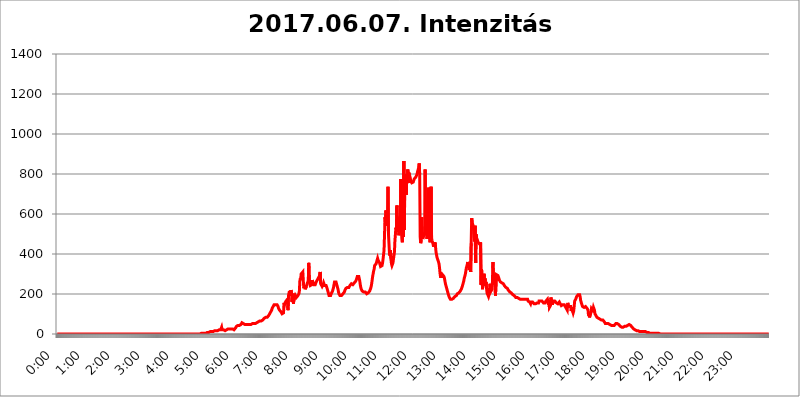
| Category | 2017.06.07. Intenzitás [W/m^2] |
|---|---|
| 0.0 | 0 |
| 0.0006944444444444445 | 0 |
| 0.001388888888888889 | 0 |
| 0.0020833333333333333 | 0 |
| 0.002777777777777778 | 0 |
| 0.003472222222222222 | 0 |
| 0.004166666666666667 | 0 |
| 0.004861111111111111 | 0 |
| 0.005555555555555556 | 0 |
| 0.0062499999999999995 | 0 |
| 0.006944444444444444 | 0 |
| 0.007638888888888889 | 0 |
| 0.008333333333333333 | 0 |
| 0.009027777777777779 | 0 |
| 0.009722222222222222 | 0 |
| 0.010416666666666666 | 0 |
| 0.011111111111111112 | 0 |
| 0.011805555555555555 | 0 |
| 0.012499999999999999 | 0 |
| 0.013194444444444444 | 0 |
| 0.013888888888888888 | 0 |
| 0.014583333333333332 | 0 |
| 0.015277777777777777 | 0 |
| 0.015972222222222224 | 0 |
| 0.016666666666666666 | 0 |
| 0.017361111111111112 | 0 |
| 0.018055555555555557 | 0 |
| 0.01875 | 0 |
| 0.019444444444444445 | 0 |
| 0.02013888888888889 | 0 |
| 0.020833333333333332 | 0 |
| 0.02152777777777778 | 0 |
| 0.022222222222222223 | 0 |
| 0.02291666666666667 | 0 |
| 0.02361111111111111 | 0 |
| 0.024305555555555556 | 0 |
| 0.024999999999999998 | 0 |
| 0.025694444444444447 | 0 |
| 0.02638888888888889 | 0 |
| 0.027083333333333334 | 0 |
| 0.027777777777777776 | 0 |
| 0.02847222222222222 | 0 |
| 0.029166666666666664 | 0 |
| 0.029861111111111113 | 0 |
| 0.030555555555555555 | 0 |
| 0.03125 | 0 |
| 0.03194444444444445 | 0 |
| 0.03263888888888889 | 0 |
| 0.03333333333333333 | 0 |
| 0.034027777777777775 | 0 |
| 0.034722222222222224 | 0 |
| 0.035416666666666666 | 0 |
| 0.036111111111111115 | 0 |
| 0.03680555555555556 | 0 |
| 0.0375 | 0 |
| 0.03819444444444444 | 0 |
| 0.03888888888888889 | 0 |
| 0.03958333333333333 | 0 |
| 0.04027777777777778 | 0 |
| 0.04097222222222222 | 0 |
| 0.041666666666666664 | 0 |
| 0.042361111111111106 | 0 |
| 0.04305555555555556 | 0 |
| 0.043750000000000004 | 0 |
| 0.044444444444444446 | 0 |
| 0.04513888888888889 | 0 |
| 0.04583333333333334 | 0 |
| 0.04652777777777778 | 0 |
| 0.04722222222222222 | 0 |
| 0.04791666666666666 | 0 |
| 0.04861111111111111 | 0 |
| 0.049305555555555554 | 0 |
| 0.049999999999999996 | 0 |
| 0.05069444444444445 | 0 |
| 0.051388888888888894 | 0 |
| 0.052083333333333336 | 0 |
| 0.05277777777777778 | 0 |
| 0.05347222222222222 | 0 |
| 0.05416666666666667 | 0 |
| 0.05486111111111111 | 0 |
| 0.05555555555555555 | 0 |
| 0.05625 | 0 |
| 0.05694444444444444 | 0 |
| 0.057638888888888885 | 0 |
| 0.05833333333333333 | 0 |
| 0.05902777777777778 | 0 |
| 0.059722222222222225 | 0 |
| 0.06041666666666667 | 0 |
| 0.061111111111111116 | 0 |
| 0.06180555555555556 | 0 |
| 0.0625 | 0 |
| 0.06319444444444444 | 0 |
| 0.06388888888888888 | 0 |
| 0.06458333333333334 | 0 |
| 0.06527777777777778 | 0 |
| 0.06597222222222222 | 0 |
| 0.06666666666666667 | 0 |
| 0.06736111111111111 | 0 |
| 0.06805555555555555 | 0 |
| 0.06874999999999999 | 0 |
| 0.06944444444444443 | 0 |
| 0.07013888888888889 | 0 |
| 0.07083333333333333 | 0 |
| 0.07152777777777779 | 0 |
| 0.07222222222222223 | 0 |
| 0.07291666666666667 | 0 |
| 0.07361111111111111 | 0 |
| 0.07430555555555556 | 0 |
| 0.075 | 0 |
| 0.07569444444444444 | 0 |
| 0.0763888888888889 | 0 |
| 0.07708333333333334 | 0 |
| 0.07777777777777778 | 0 |
| 0.07847222222222222 | 0 |
| 0.07916666666666666 | 0 |
| 0.0798611111111111 | 0 |
| 0.08055555555555556 | 0 |
| 0.08125 | 0 |
| 0.08194444444444444 | 0 |
| 0.08263888888888889 | 0 |
| 0.08333333333333333 | 0 |
| 0.08402777777777777 | 0 |
| 0.08472222222222221 | 0 |
| 0.08541666666666665 | 0 |
| 0.08611111111111112 | 0 |
| 0.08680555555555557 | 0 |
| 0.08750000000000001 | 0 |
| 0.08819444444444445 | 0 |
| 0.08888888888888889 | 0 |
| 0.08958333333333333 | 0 |
| 0.09027777777777778 | 0 |
| 0.09097222222222222 | 0 |
| 0.09166666666666667 | 0 |
| 0.09236111111111112 | 0 |
| 0.09305555555555556 | 0 |
| 0.09375 | 0 |
| 0.09444444444444444 | 0 |
| 0.09513888888888888 | 0 |
| 0.09583333333333333 | 0 |
| 0.09652777777777777 | 0 |
| 0.09722222222222222 | 0 |
| 0.09791666666666667 | 0 |
| 0.09861111111111111 | 0 |
| 0.09930555555555555 | 0 |
| 0.09999999999999999 | 0 |
| 0.10069444444444443 | 0 |
| 0.1013888888888889 | 0 |
| 0.10208333333333335 | 0 |
| 0.10277777777777779 | 0 |
| 0.10347222222222223 | 0 |
| 0.10416666666666667 | 0 |
| 0.10486111111111111 | 0 |
| 0.10555555555555556 | 0 |
| 0.10625 | 0 |
| 0.10694444444444444 | 0 |
| 0.1076388888888889 | 0 |
| 0.10833333333333334 | 0 |
| 0.10902777777777778 | 0 |
| 0.10972222222222222 | 0 |
| 0.1111111111111111 | 0 |
| 0.11180555555555556 | 0 |
| 0.11180555555555556 | 0 |
| 0.1125 | 0 |
| 0.11319444444444444 | 0 |
| 0.11388888888888889 | 0 |
| 0.11458333333333333 | 0 |
| 0.11527777777777777 | 0 |
| 0.11597222222222221 | 0 |
| 0.11666666666666665 | 0 |
| 0.1173611111111111 | 0 |
| 0.11805555555555557 | 0 |
| 0.11944444444444445 | 0 |
| 0.12013888888888889 | 0 |
| 0.12083333333333333 | 0 |
| 0.12152777777777778 | 0 |
| 0.12222222222222223 | 0 |
| 0.12291666666666667 | 0 |
| 0.12291666666666667 | 0 |
| 0.12361111111111112 | 0 |
| 0.12430555555555556 | 0 |
| 0.125 | 0 |
| 0.12569444444444444 | 0 |
| 0.12638888888888888 | 0 |
| 0.12708333333333333 | 0 |
| 0.16875 | 0 |
| 0.12847222222222224 | 0 |
| 0.12916666666666668 | 0 |
| 0.12986111111111112 | 0 |
| 0.13055555555555556 | 0 |
| 0.13125 | 0 |
| 0.13194444444444445 | 0 |
| 0.1326388888888889 | 0 |
| 0.13333333333333333 | 0 |
| 0.13402777777777777 | 0 |
| 0.13402777777777777 | 0 |
| 0.13472222222222222 | 0 |
| 0.13541666666666666 | 0 |
| 0.1361111111111111 | 0 |
| 0.13749999999999998 | 0 |
| 0.13819444444444443 | 0 |
| 0.1388888888888889 | 0 |
| 0.13958333333333334 | 0 |
| 0.14027777777777778 | 0 |
| 0.14097222222222222 | 0 |
| 0.14166666666666666 | 0 |
| 0.1423611111111111 | 0 |
| 0.14305555555555557 | 0 |
| 0.14375000000000002 | 0 |
| 0.14444444444444446 | 0 |
| 0.1451388888888889 | 0 |
| 0.1451388888888889 | 0 |
| 0.14652777777777778 | 0 |
| 0.14722222222222223 | 0 |
| 0.14791666666666667 | 0 |
| 0.1486111111111111 | 0 |
| 0.14930555555555555 | 0 |
| 0.15 | 0 |
| 0.15069444444444444 | 0 |
| 0.15138888888888888 | 0 |
| 0.15208333333333332 | 0 |
| 0.15277777777777776 | 0 |
| 0.15347222222222223 | 0 |
| 0.15416666666666667 | 0 |
| 0.15486111111111112 | 0 |
| 0.15555555555555556 | 0 |
| 0.15625 | 0 |
| 0.15694444444444444 | 0 |
| 0.15763888888888888 | 0 |
| 0.15833333333333333 | 0 |
| 0.15902777777777777 | 0 |
| 0.15972222222222224 | 0 |
| 0.16041666666666668 | 0 |
| 0.16111111111111112 | 0 |
| 0.16180555555555556 | 0 |
| 0.1625 | 0 |
| 0.16319444444444445 | 0 |
| 0.1638888888888889 | 0 |
| 0.16458333333333333 | 0 |
| 0.16527777777777777 | 0 |
| 0.16597222222222222 | 0 |
| 0.16666666666666666 | 0 |
| 0.1673611111111111 | 0 |
| 0.16805555555555554 | 0 |
| 0.16874999999999998 | 0 |
| 0.16944444444444443 | 0 |
| 0.17013888888888887 | 0 |
| 0.1708333333333333 | 0 |
| 0.17152777777777775 | 0 |
| 0.17222222222222225 | 0 |
| 0.1729166666666667 | 0 |
| 0.17361111111111113 | 0 |
| 0.17430555555555557 | 0 |
| 0.17500000000000002 | 0 |
| 0.17569444444444446 | 0 |
| 0.1763888888888889 | 0 |
| 0.17708333333333334 | 0 |
| 0.17777777777777778 | 0 |
| 0.17847222222222223 | 0 |
| 0.17916666666666667 | 0 |
| 0.1798611111111111 | 0 |
| 0.18055555555555555 | 0 |
| 0.18125 | 0 |
| 0.18194444444444444 | 0 |
| 0.1826388888888889 | 0 |
| 0.18333333333333335 | 0 |
| 0.1840277777777778 | 0 |
| 0.18472222222222223 | 0 |
| 0.18541666666666667 | 0 |
| 0.18611111111111112 | 0 |
| 0.18680555555555556 | 0 |
| 0.1875 | 0 |
| 0.18819444444444444 | 0 |
| 0.18888888888888888 | 0 |
| 0.18958333333333333 | 0 |
| 0.19027777777777777 | 0 |
| 0.1909722222222222 | 0 |
| 0.19166666666666665 | 0 |
| 0.19236111111111112 | 0 |
| 0.19305555555555554 | 0 |
| 0.19375 | 0 |
| 0.19444444444444445 | 0 |
| 0.1951388888888889 | 0 |
| 0.19583333333333333 | 0 |
| 0.19652777777777777 | 0 |
| 0.19722222222222222 | 0 |
| 0.19791666666666666 | 0 |
| 0.1986111111111111 | 0 |
| 0.19930555555555554 | 0 |
| 0.19999999999999998 | 0 |
| 0.20069444444444443 | 0 |
| 0.20138888888888887 | 3.525 |
| 0.2020833333333333 | 3.525 |
| 0.2027777777777778 | 3.525 |
| 0.2034722222222222 | 3.525 |
| 0.2041666666666667 | 3.525 |
| 0.20486111111111113 | 3.525 |
| 0.20555555555555557 | 3.525 |
| 0.20625000000000002 | 3.525 |
| 0.20694444444444446 | 3.525 |
| 0.2076388888888889 | 3.525 |
| 0.20833333333333334 | 3.525 |
| 0.20902777777777778 | 3.525 |
| 0.20972222222222223 | 3.525 |
| 0.21041666666666667 | 7.887 |
| 0.2111111111111111 | 7.887 |
| 0.21180555555555555 | 7.887 |
| 0.2125 | 7.887 |
| 0.21319444444444444 | 12.257 |
| 0.2138888888888889 | 12.257 |
| 0.21458333333333335 | 12.257 |
| 0.2152777777777778 | 12.257 |
| 0.21597222222222223 | 12.257 |
| 0.21666666666666667 | 12.257 |
| 0.21736111111111112 | 12.257 |
| 0.21805555555555556 | 12.257 |
| 0.21875 | 12.257 |
| 0.21944444444444444 | 12.257 |
| 0.22013888888888888 | 12.257 |
| 0.22083333333333333 | 16.636 |
| 0.22152777777777777 | 16.636 |
| 0.2222222222222222 | 16.636 |
| 0.22291666666666665 | 16.636 |
| 0.2236111111111111 | 16.636 |
| 0.22430555555555556 | 16.636 |
| 0.225 | 16.636 |
| 0.22569444444444445 | 16.636 |
| 0.2263888888888889 | 16.636 |
| 0.22708333333333333 | 21.024 |
| 0.22777777777777777 | 16.636 |
| 0.22847222222222222 | 16.636 |
| 0.22916666666666666 | 21.024 |
| 0.2298611111111111 | 25.419 |
| 0.23055555555555554 | 34.234 |
| 0.23124999999999998 | 21.024 |
| 0.23194444444444443 | 25.419 |
| 0.23263888888888887 | 25.419 |
| 0.2333333333333333 | 21.024 |
| 0.2340277777777778 | 16.636 |
| 0.2347222222222222 | 16.636 |
| 0.2354166666666667 | 16.636 |
| 0.23611111111111113 | 21.024 |
| 0.23680555555555557 | 21.024 |
| 0.23750000000000002 | 21.024 |
| 0.23819444444444446 | 21.024 |
| 0.2388888888888889 | 21.024 |
| 0.23958333333333334 | 25.419 |
| 0.24027777777777778 | 25.419 |
| 0.24097222222222223 | 25.419 |
| 0.24166666666666667 | 25.419 |
| 0.2423611111111111 | 25.419 |
| 0.24305555555555555 | 25.419 |
| 0.24375 | 25.419 |
| 0.24444444444444446 | 25.419 |
| 0.24513888888888888 | 21.024 |
| 0.24583333333333335 | 25.419 |
| 0.2465277777777778 | 21.024 |
| 0.24722222222222223 | 21.024 |
| 0.24791666666666667 | 21.024 |
| 0.24861111111111112 | 25.419 |
| 0.24930555555555556 | 25.419 |
| 0.25 | 29.823 |
| 0.25069444444444444 | 29.823 |
| 0.2513888888888889 | 38.653 |
| 0.2520833333333333 | 38.653 |
| 0.25277777777777777 | 43.079 |
| 0.2534722222222222 | 43.079 |
| 0.25416666666666665 | 43.079 |
| 0.2548611111111111 | 43.079 |
| 0.2555555555555556 | 43.079 |
| 0.25625000000000003 | 43.079 |
| 0.2569444444444445 | 47.511 |
| 0.2576388888888889 | 47.511 |
| 0.25833333333333336 | 51.951 |
| 0.2590277777777778 | 56.398 |
| 0.25972222222222224 | 56.398 |
| 0.2604166666666667 | 51.951 |
| 0.2611111111111111 | 51.951 |
| 0.26180555555555557 | 51.951 |
| 0.2625 | 47.511 |
| 0.26319444444444445 | 47.511 |
| 0.2638888888888889 | 47.511 |
| 0.26458333333333334 | 47.511 |
| 0.2652777777777778 | 47.511 |
| 0.2659722222222222 | 47.511 |
| 0.26666666666666666 | 47.511 |
| 0.2673611111111111 | 47.511 |
| 0.26805555555555555 | 47.511 |
| 0.26875 | 47.511 |
| 0.26944444444444443 | 47.511 |
| 0.2701388888888889 | 47.511 |
| 0.2708333333333333 | 47.511 |
| 0.27152777777777776 | 47.511 |
| 0.2722222222222222 | 47.511 |
| 0.27291666666666664 | 51.951 |
| 0.2736111111111111 | 51.951 |
| 0.2743055555555555 | 51.951 |
| 0.27499999999999997 | 51.951 |
| 0.27569444444444446 | 51.951 |
| 0.27638888888888885 | 51.951 |
| 0.27708333333333335 | 51.951 |
| 0.2777777777777778 | 51.951 |
| 0.27847222222222223 | 51.951 |
| 0.2791666666666667 | 51.951 |
| 0.2798611111111111 | 56.398 |
| 0.28055555555555556 | 56.398 |
| 0.28125 | 60.85 |
| 0.28194444444444444 | 60.85 |
| 0.2826388888888889 | 60.85 |
| 0.2833333333333333 | 60.85 |
| 0.28402777777777777 | 65.31 |
| 0.2847222222222222 | 65.31 |
| 0.28541666666666665 | 65.31 |
| 0.28611111111111115 | 65.31 |
| 0.28680555555555554 | 65.31 |
| 0.28750000000000003 | 69.775 |
| 0.2881944444444445 | 69.775 |
| 0.2888888888888889 | 69.775 |
| 0.28958333333333336 | 74.246 |
| 0.2902777777777778 | 78.722 |
| 0.29097222222222224 | 83.205 |
| 0.2916666666666667 | 83.205 |
| 0.2923611111111111 | 83.205 |
| 0.29305555555555557 | 83.205 |
| 0.29375 | 83.205 |
| 0.29444444444444445 | 83.205 |
| 0.2951388888888889 | 83.205 |
| 0.29583333333333334 | 87.692 |
| 0.2965277777777778 | 92.184 |
| 0.2972222222222222 | 92.184 |
| 0.29791666666666666 | 101.184 |
| 0.2986111111111111 | 105.69 |
| 0.29930555555555555 | 110.201 |
| 0.3 | 114.716 |
| 0.30069444444444443 | 119.235 |
| 0.3013888888888889 | 128.284 |
| 0.3020833333333333 | 132.814 |
| 0.30277777777777776 | 137.347 |
| 0.3034722222222222 | 141.884 |
| 0.30416666666666664 | 146.423 |
| 0.3048611111111111 | 146.423 |
| 0.3055555555555555 | 146.423 |
| 0.30624999999999997 | 146.423 |
| 0.3069444444444444 | 146.423 |
| 0.3076388888888889 | 146.423 |
| 0.30833333333333335 | 146.423 |
| 0.3090277777777778 | 141.884 |
| 0.30972222222222223 | 137.347 |
| 0.3104166666666667 | 128.284 |
| 0.3111111111111111 | 123.758 |
| 0.31180555555555556 | 119.235 |
| 0.3125 | 119.235 |
| 0.31319444444444444 | 114.716 |
| 0.3138888888888889 | 110.201 |
| 0.3145833333333333 | 105.69 |
| 0.31527777777777777 | 101.184 |
| 0.3159722222222222 | 96.682 |
| 0.31666666666666665 | 101.184 |
| 0.31736111111111115 | 105.69 |
| 0.31805555555555554 | 155.509 |
| 0.31875000000000003 | 146.423 |
| 0.3194444444444445 | 155.509 |
| 0.3201388888888889 | 160.056 |
| 0.32083333333333336 | 164.605 |
| 0.3215277777777778 | 164.605 |
| 0.32222222222222224 | 169.156 |
| 0.3229166666666667 | 173.709 |
| 0.3236111111111111 | 119.235 |
| 0.32430555555555557 | 191.937 |
| 0.325 | 196.497 |
| 0.32569444444444445 | 214.746 |
| 0.3263888888888889 | 191.937 |
| 0.32708333333333334 | 196.497 |
| 0.3277777777777778 | 219.309 |
| 0.3284722222222222 | 210.182 |
| 0.32916666666666666 | 160.056 |
| 0.3298611111111111 | 155.509 |
| 0.33055555555555555 | 201.058 |
| 0.33125 | 150.964 |
| 0.33194444444444443 | 201.058 |
| 0.3326388888888889 | 201.058 |
| 0.3333333333333333 | 182.82 |
| 0.3340277777777778 | 191.937 |
| 0.3347222222222222 | 187.378 |
| 0.3354166666666667 | 182.82 |
| 0.3361111111111111 | 187.378 |
| 0.3368055555555556 | 187.378 |
| 0.33749999999999997 | 191.937 |
| 0.33819444444444446 | 191.937 |
| 0.33888888888888885 | 201.058 |
| 0.33958333333333335 | 214.746 |
| 0.34027777777777773 | 264.932 |
| 0.34097222222222223 | 278.603 |
| 0.3416666666666666 | 269.49 |
| 0.3423611111111111 | 301.354 |
| 0.3430555555555555 | 305.898 |
| 0.34375 | 296.808 |
| 0.3444444444444445 | 310.44 |
| 0.3451388888888889 | 264.932 |
| 0.3458333333333334 | 228.436 |
| 0.34652777777777777 | 228.436 |
| 0.34722222222222227 | 242.127 |
| 0.34791666666666665 | 223.873 |
| 0.34861111111111115 | 228.436 |
| 0.34930555555555554 | 237.564 |
| 0.35000000000000003 | 246.689 |
| 0.3506944444444444 | 251.251 |
| 0.3513888888888889 | 260.373 |
| 0.3520833333333333 | 269.49 |
| 0.3527777777777778 | 355.712 |
| 0.3534722222222222 | 269.49 |
| 0.3541666666666667 | 251.251 |
| 0.3548611111111111 | 242.127 |
| 0.35555555555555557 | 242.127 |
| 0.35625 | 242.127 |
| 0.35694444444444445 | 246.689 |
| 0.3576388888888889 | 269.49 |
| 0.35833333333333334 | 260.373 |
| 0.3590277777777778 | 264.932 |
| 0.3597222222222222 | 246.689 |
| 0.36041666666666666 | 242.127 |
| 0.3611111111111111 | 242.127 |
| 0.36180555555555555 | 246.689 |
| 0.3625 | 251.251 |
| 0.36319444444444443 | 260.373 |
| 0.3638888888888889 | 260.373 |
| 0.3645833333333333 | 260.373 |
| 0.3652777777777778 | 274.047 |
| 0.3659722222222222 | 274.047 |
| 0.3666666666666667 | 283.156 |
| 0.3673611111111111 | 278.603 |
| 0.3680555555555556 | 269.49 |
| 0.36874999999999997 | 310.44 |
| 0.36944444444444446 | 251.251 |
| 0.37013888888888885 | 246.689 |
| 0.37083333333333335 | 251.251 |
| 0.37152777777777773 | 237.564 |
| 0.37222222222222223 | 242.127 |
| 0.3729166666666666 | 246.689 |
| 0.3736111111111111 | 255.813 |
| 0.3743055555555555 | 251.251 |
| 0.375 | 242.127 |
| 0.3756944444444445 | 242.127 |
| 0.3763888888888889 | 242.127 |
| 0.3770833333333334 | 242.127 |
| 0.37777777777777777 | 237.564 |
| 0.37847222222222227 | 228.436 |
| 0.37916666666666665 | 219.309 |
| 0.37986111111111115 | 210.182 |
| 0.38055555555555554 | 201.058 |
| 0.38125000000000003 | 191.937 |
| 0.3819444444444444 | 191.937 |
| 0.3826388888888889 | 191.937 |
| 0.3833333333333333 | 191.937 |
| 0.3840277777777778 | 196.497 |
| 0.3847222222222222 | 205.62 |
| 0.3854166666666667 | 210.182 |
| 0.3861111111111111 | 214.746 |
| 0.38680555555555557 | 219.309 |
| 0.3875 | 233 |
| 0.38819444444444445 | 246.689 |
| 0.3888888888888889 | 260.373 |
| 0.38958333333333334 | 264.932 |
| 0.3902777777777778 | 264.932 |
| 0.3909722222222222 | 260.373 |
| 0.39166666666666666 | 255.813 |
| 0.3923611111111111 | 242.127 |
| 0.39305555555555555 | 233 |
| 0.39375 | 223.873 |
| 0.39444444444444443 | 210.182 |
| 0.3951388888888889 | 201.058 |
| 0.3958333333333333 | 196.497 |
| 0.3965277777777778 | 191.937 |
| 0.3972222222222222 | 191.937 |
| 0.3979166666666667 | 191.937 |
| 0.3986111111111111 | 191.937 |
| 0.3993055555555556 | 196.497 |
| 0.39999999999999997 | 196.497 |
| 0.40069444444444446 | 201.058 |
| 0.40138888888888885 | 201.058 |
| 0.40208333333333335 | 205.62 |
| 0.40277777777777773 | 210.182 |
| 0.40347222222222223 | 219.309 |
| 0.4041666666666666 | 223.873 |
| 0.4048611111111111 | 228.436 |
| 0.4055555555555555 | 228.436 |
| 0.40625 | 233 |
| 0.4069444444444445 | 233 |
| 0.4076388888888889 | 233 |
| 0.4083333333333334 | 228.436 |
| 0.40902777777777777 | 233 |
| 0.40972222222222227 | 237.564 |
| 0.41041666666666665 | 242.127 |
| 0.41111111111111115 | 242.127 |
| 0.41180555555555554 | 242.127 |
| 0.41250000000000003 | 251.251 |
| 0.4131944444444444 | 255.813 |
| 0.4138888888888889 | 251.251 |
| 0.4145833333333333 | 246.689 |
| 0.4152777777777778 | 242.127 |
| 0.4159722222222222 | 242.127 |
| 0.4166666666666667 | 255.813 |
| 0.4173611111111111 | 260.373 |
| 0.41805555555555557 | 260.373 |
| 0.41875 | 264.932 |
| 0.41944444444444445 | 269.49 |
| 0.4201388888888889 | 278.603 |
| 0.42083333333333334 | 287.709 |
| 0.4215277777777778 | 292.259 |
| 0.4222222222222222 | 292.259 |
| 0.42291666666666666 | 287.709 |
| 0.4236111111111111 | 283.156 |
| 0.42430555555555555 | 264.932 |
| 0.425 | 246.689 |
| 0.42569444444444443 | 233 |
| 0.4263888888888889 | 223.873 |
| 0.4270833333333333 | 219.309 |
| 0.4277777777777778 | 214.746 |
| 0.4284722222222222 | 210.182 |
| 0.4291666666666667 | 210.182 |
| 0.4298611111111111 | 210.182 |
| 0.4305555555555556 | 210.182 |
| 0.43124999999999997 | 210.182 |
| 0.43194444444444446 | 210.182 |
| 0.43263888888888885 | 210.182 |
| 0.43333333333333335 | 205.62 |
| 0.43402777777777773 | 201.058 |
| 0.43472222222222223 | 201.058 |
| 0.4354166666666666 | 205.62 |
| 0.4361111111111111 | 205.62 |
| 0.4368055555555555 | 205.62 |
| 0.4375 | 210.182 |
| 0.4381944444444445 | 214.746 |
| 0.4388888888888889 | 219.309 |
| 0.4395833333333334 | 228.436 |
| 0.44027777777777777 | 237.564 |
| 0.44097222222222227 | 251.251 |
| 0.44166666666666665 | 269.49 |
| 0.44236111111111115 | 287.709 |
| 0.44305555555555554 | 301.354 |
| 0.44375000000000003 | 314.98 |
| 0.4444444444444444 | 324.052 |
| 0.4451388888888889 | 342.162 |
| 0.4458333333333333 | 342.162 |
| 0.4465277777777778 | 346.682 |
| 0.4472222222222222 | 351.198 |
| 0.4479166666666667 | 360.221 |
| 0.4486111111111111 | 364.728 |
| 0.44930555555555557 | 378.224 |
| 0.45 | 369.23 |
| 0.45069444444444445 | 369.23 |
| 0.4513888888888889 | 364.728 |
| 0.45208333333333334 | 355.712 |
| 0.4527777777777778 | 346.682 |
| 0.4534722222222222 | 337.639 |
| 0.45416666666666666 | 333.113 |
| 0.4548611111111111 | 333.113 |
| 0.45555555555555555 | 342.162 |
| 0.45625 | 355.712 |
| 0.45694444444444443 | 373.729 |
| 0.4576388888888889 | 396.164 |
| 0.4583333333333333 | 418.492 |
| 0.4590277777777778 | 497.836 |
| 0.4597222222222222 | 583.779 |
| 0.4604166666666667 | 549.704 |
| 0.4611111111111111 | 617.436 |
| 0.4618055555555556 | 562.53 |
| 0.46249999999999997 | 541.121 |
| 0.46319444444444446 | 592.233 |
| 0.46388888888888885 | 735.89 |
| 0.46458333333333335 | 497.836 |
| 0.46527777777777773 | 449.551 |
| 0.46597222222222223 | 400.638 |
| 0.4666666666666666 | 391.685 |
| 0.4673611111111111 | 418.492 |
| 0.4680555555555555 | 373.729 |
| 0.46875 | 351.198 |
| 0.4694444444444445 | 342.162 |
| 0.4701388888888889 | 346.682 |
| 0.4708333333333334 | 355.712 |
| 0.47152777777777777 | 373.729 |
| 0.47222222222222227 | 391.685 |
| 0.47291666666666665 | 409.574 |
| 0.47361111111111115 | 467.187 |
| 0.47430555555555554 | 462.786 |
| 0.47500000000000003 | 532.513 |
| 0.4756944444444444 | 523.88 |
| 0.4763888888888889 | 642.4 |
| 0.4770833333333333 | 528.2 |
| 0.4777777777777778 | 541.121 |
| 0.4784722222222222 | 523.88 |
| 0.4791666666666667 | 493.475 |
| 0.4798611111111111 | 515.223 |
| 0.48055555555555557 | 583.779 |
| 0.48125 | 506.542 |
| 0.48194444444444445 | 775.492 |
| 0.4826388888888889 | 515.223 |
| 0.48333333333333334 | 480.356 |
| 0.4840277777777778 | 458.38 |
| 0.4847222222222222 | 667.123 |
| 0.48541666666666666 | 484.735 |
| 0.4861111111111111 | 864.493 |
| 0.48680555555555555 | 519.555 |
| 0.4875 | 798.974 |
| 0.48819444444444443 | 783.342 |
| 0.4888888888888889 | 743.859 |
| 0.4895833333333333 | 695.666 |
| 0.4902777777777778 | 783.342 |
| 0.4909722222222222 | 755.766 |
| 0.4916666666666667 | 822.26 |
| 0.4923611111111111 | 755.766 |
| 0.4930555555555556 | 806.757 |
| 0.49374999999999997 | 798.974 |
| 0.49444444444444446 | 795.074 |
| 0.49513888888888885 | 779.42 |
| 0.49583333333333335 | 763.674 |
| 0.49652777777777773 | 759.723 |
| 0.49722222222222223 | 755.766 |
| 0.4979166666666666 | 755.766 |
| 0.4986111111111111 | 755.766 |
| 0.4993055555555555 | 759.723 |
| 0.5 | 767.62 |
| 0.5006944444444444 | 775.492 |
| 0.5013888888888889 | 775.492 |
| 0.5020833333333333 | 779.42 |
| 0.5027777777777778 | 783.342 |
| 0.5034722222222222 | 787.258 |
| 0.5041666666666667 | 795.074 |
| 0.5048611111111111 | 802.868 |
| 0.5055555555555555 | 814.519 |
| 0.50625 | 822.26 |
| 0.5069444444444444 | 833.834 |
| 0.5076388888888889 | 853.029 |
| 0.5083333333333333 | 798.974 |
| 0.5090277777777777 | 484.735 |
| 0.5097222222222222 | 453.968 |
| 0.5104166666666666 | 467.187 |
| 0.5111111111111112 | 583.779 |
| 0.5118055555555555 | 475.972 |
| 0.5125000000000001 | 497.836 |
| 0.5131944444444444 | 497.836 |
| 0.513888888888889 | 489.108 |
| 0.5145833333333333 | 489.108 |
| 0.5152777777777778 | 506.542 |
| 0.5159722222222222 | 822.26 |
| 0.5166666666666667 | 515.223 |
| 0.517361111111111 | 493.475 |
| 0.5180555555555556 | 515.223 |
| 0.5187499999999999 | 475.972 |
| 0.5194444444444445 | 493.475 |
| 0.5201388888888888 | 658.909 |
| 0.5208333333333334 | 731.896 |
| 0.5215277777777778 | 683.473 |
| 0.5222222222222223 | 489.108 |
| 0.5229166666666667 | 458.38 |
| 0.5236111111111111 | 453.968 |
| 0.5243055555555556 | 735.89 |
| 0.525 | 480.356 |
| 0.5256944444444445 | 467.187 |
| 0.5263888888888889 | 471.582 |
| 0.5270833333333333 | 449.551 |
| 0.5277777777777778 | 436.27 |
| 0.5284722222222222 | 431.833 |
| 0.5291666666666667 | 440.702 |
| 0.5298611111111111 | 458.38 |
| 0.5305555555555556 | 436.27 |
| 0.53125 | 409.574 |
| 0.5319444444444444 | 396.164 |
| 0.5326388888888889 | 382.715 |
| 0.5333333333333333 | 382.715 |
| 0.5340277777777778 | 378.224 |
| 0.5347222222222222 | 360.221 |
| 0.5354166666666667 | 351.198 |
| 0.5361111111111111 | 333.113 |
| 0.5368055555555555 | 305.898 |
| 0.5375 | 287.709 |
| 0.5381944444444444 | 283.156 |
| 0.5388888888888889 | 283.156 |
| 0.5395833333333333 | 287.709 |
| 0.5402777777777777 | 296.808 |
| 0.5409722222222222 | 296.808 |
| 0.5416666666666666 | 296.808 |
| 0.5423611111111112 | 287.709 |
| 0.5430555555555555 | 278.603 |
| 0.5437500000000001 | 264.932 |
| 0.5444444444444444 | 251.251 |
| 0.545138888888889 | 242.127 |
| 0.5458333333333333 | 233 |
| 0.5465277777777778 | 223.873 |
| 0.5472222222222222 | 214.746 |
| 0.5479166666666667 | 205.62 |
| 0.548611111111111 | 196.497 |
| 0.5493055555555556 | 191.937 |
| 0.5499999999999999 | 182.82 |
| 0.5506944444444445 | 178.264 |
| 0.5513888888888888 | 173.709 |
| 0.5520833333333334 | 173.709 |
| 0.5527777777777778 | 173.709 |
| 0.5534722222222223 | 173.709 |
| 0.5541666666666667 | 173.709 |
| 0.5548611111111111 | 173.709 |
| 0.5555555555555556 | 178.264 |
| 0.55625 | 182.82 |
| 0.5569444444444445 | 182.82 |
| 0.5576388888888889 | 187.378 |
| 0.5583333333333333 | 191.937 |
| 0.5590277777777778 | 191.937 |
| 0.5597222222222222 | 191.937 |
| 0.5604166666666667 | 196.497 |
| 0.5611111111111111 | 201.058 |
| 0.5618055555555556 | 201.058 |
| 0.5625 | 205.62 |
| 0.5631944444444444 | 205.62 |
| 0.5638888888888889 | 205.62 |
| 0.5645833333333333 | 210.182 |
| 0.5652777777777778 | 214.746 |
| 0.5659722222222222 | 219.309 |
| 0.5666666666666667 | 223.873 |
| 0.5673611111111111 | 228.436 |
| 0.5680555555555555 | 237.564 |
| 0.56875 | 246.689 |
| 0.5694444444444444 | 255.813 |
| 0.5701388888888889 | 264.932 |
| 0.5708333333333333 | 278.603 |
| 0.5715277777777777 | 287.709 |
| 0.5722222222222222 | 296.808 |
| 0.5729166666666666 | 310.44 |
| 0.5736111111111112 | 328.584 |
| 0.5743055555555555 | 337.639 |
| 0.5750000000000001 | 346.682 |
| 0.5756944444444444 | 360.221 |
| 0.576388888888889 | 351.198 |
| 0.5770833333333333 | 337.639 |
| 0.5777777777777778 | 319.517 |
| 0.5784722222222222 | 314.98 |
| 0.5791666666666667 | 342.162 |
| 0.579861111111111 | 310.44 |
| 0.5805555555555556 | 453.968 |
| 0.5812499999999999 | 579.542 |
| 0.5819444444444445 | 558.261 |
| 0.5826388888888888 | 549.704 |
| 0.5833333333333334 | 541.121 |
| 0.5840277777777778 | 532.513 |
| 0.5847222222222223 | 536.82 |
| 0.5854166666666667 | 462.786 |
| 0.5861111111111111 | 541.121 |
| 0.5868055555555556 | 355.712 |
| 0.5875 | 497.836 |
| 0.5881944444444445 | 480.356 |
| 0.5888888888888889 | 475.972 |
| 0.5895833333333333 | 467.187 |
| 0.5902777777777778 | 458.38 |
| 0.5909722222222222 | 453.968 |
| 0.5916666666666667 | 453.968 |
| 0.5923611111111111 | 449.551 |
| 0.5930555555555556 | 445.129 |
| 0.59375 | 458.38 |
| 0.5944444444444444 | 246.689 |
| 0.5951388888888889 | 324.052 |
| 0.5958333333333333 | 269.49 |
| 0.5965277777777778 | 223.873 |
| 0.5972222222222222 | 292.259 |
| 0.5979166666666667 | 264.932 |
| 0.5986111111111111 | 301.354 |
| 0.5993055555555555 | 260.373 |
| 0.6 | 278.603 |
| 0.6006944444444444 | 242.127 |
| 0.6013888888888889 | 260.373 |
| 0.6020833333333333 | 228.436 |
| 0.6027777777777777 | 205.62 |
| 0.6034722222222222 | 201.058 |
| 0.6041666666666666 | 210.182 |
| 0.6048611111111112 | 187.378 |
| 0.6055555555555555 | 196.497 |
| 0.6062500000000001 | 196.497 |
| 0.6069444444444444 | 251.251 |
| 0.607638888888889 | 246.689 |
| 0.6083333333333333 | 214.746 |
| 0.6090277777777778 | 214.746 |
| 0.6097222222222222 | 223.873 |
| 0.6104166666666667 | 264.932 |
| 0.611111111111111 | 360.221 |
| 0.6118055555555556 | 264.932 |
| 0.6124999999999999 | 246.689 |
| 0.6131944444444445 | 283.156 |
| 0.6138888888888888 | 301.354 |
| 0.6145833333333334 | 191.937 |
| 0.6152777777777778 | 191.937 |
| 0.6159722222222223 | 296.808 |
| 0.6166666666666667 | 301.354 |
| 0.6173611111111111 | 301.354 |
| 0.6180555555555556 | 292.259 |
| 0.61875 | 287.709 |
| 0.6194444444444445 | 278.603 |
| 0.6201388888888889 | 269.49 |
| 0.6208333333333333 | 264.932 |
| 0.6215277777777778 | 260.373 |
| 0.6222222222222222 | 260.373 |
| 0.6229166666666667 | 255.813 |
| 0.6236111111111111 | 255.813 |
| 0.6243055555555556 | 251.251 |
| 0.625 | 251.251 |
| 0.6256944444444444 | 251.251 |
| 0.6263888888888889 | 246.689 |
| 0.6270833333333333 | 242.127 |
| 0.6277777777777778 | 242.127 |
| 0.6284722222222222 | 237.564 |
| 0.6291666666666667 | 233 |
| 0.6298611111111111 | 233 |
| 0.6305555555555555 | 228.436 |
| 0.63125 | 228.436 |
| 0.6319444444444444 | 223.873 |
| 0.6326388888888889 | 219.309 |
| 0.6333333333333333 | 219.309 |
| 0.6340277777777777 | 214.746 |
| 0.6347222222222222 | 210.182 |
| 0.6354166666666666 | 210.182 |
| 0.6361111111111112 | 205.62 |
| 0.6368055555555555 | 205.62 |
| 0.6375000000000001 | 201.058 |
| 0.6381944444444444 | 201.058 |
| 0.638888888888889 | 196.497 |
| 0.6395833333333333 | 191.937 |
| 0.6402777777777778 | 191.937 |
| 0.6409722222222222 | 191.937 |
| 0.6416666666666667 | 187.378 |
| 0.642361111111111 | 187.378 |
| 0.6430555555555556 | 182.82 |
| 0.6437499999999999 | 182.82 |
| 0.6444444444444445 | 182.82 |
| 0.6451388888888888 | 182.82 |
| 0.6458333333333334 | 178.264 |
| 0.6465277777777778 | 178.264 |
| 0.6472222222222223 | 178.264 |
| 0.6479166666666667 | 178.264 |
| 0.6486111111111111 | 173.709 |
| 0.6493055555555556 | 173.709 |
| 0.65 | 173.709 |
| 0.6506944444444445 | 173.709 |
| 0.6513888888888889 | 173.709 |
| 0.6520833333333333 | 173.709 |
| 0.6527777777777778 | 173.709 |
| 0.6534722222222222 | 173.709 |
| 0.6541666666666667 | 178.264 |
| 0.6548611111111111 | 178.264 |
| 0.6555555555555556 | 173.709 |
| 0.65625 | 169.156 |
| 0.6569444444444444 | 169.156 |
| 0.6576388888888889 | 173.709 |
| 0.6583333333333333 | 173.709 |
| 0.6590277777777778 | 178.264 |
| 0.6597222222222222 | 173.709 |
| 0.6604166666666667 | 164.605 |
| 0.6611111111111111 | 164.605 |
| 0.6618055555555555 | 160.056 |
| 0.6625 | 160.056 |
| 0.6631944444444444 | 160.056 |
| 0.6638888888888889 | 150.964 |
| 0.6645833333333333 | 160.056 |
| 0.6652777777777777 | 164.605 |
| 0.6659722222222222 | 160.056 |
| 0.6666666666666666 | 160.056 |
| 0.6673611111111111 | 155.509 |
| 0.6680555555555556 | 155.509 |
| 0.6687500000000001 | 150.964 |
| 0.6694444444444444 | 150.964 |
| 0.6701388888888888 | 150.964 |
| 0.6708333333333334 | 150.964 |
| 0.6715277777777778 | 150.964 |
| 0.6722222222222222 | 155.509 |
| 0.6729166666666666 | 155.509 |
| 0.6736111111111112 | 155.509 |
| 0.6743055555555556 | 155.509 |
| 0.6749999999999999 | 155.509 |
| 0.6756944444444444 | 164.605 |
| 0.6763888888888889 | 164.605 |
| 0.6770833333333334 | 164.605 |
| 0.6777777777777777 | 164.605 |
| 0.6784722222222223 | 164.605 |
| 0.6791666666666667 | 164.605 |
| 0.6798611111111111 | 164.605 |
| 0.6805555555555555 | 160.056 |
| 0.68125 | 160.056 |
| 0.6819444444444445 | 155.509 |
| 0.6826388888888889 | 155.509 |
| 0.6833333333333332 | 155.509 |
| 0.6840277777777778 | 155.509 |
| 0.6847222222222222 | 160.056 |
| 0.6854166666666667 | 164.605 |
| 0.686111111111111 | 169.156 |
| 0.6868055555555556 | 169.156 |
| 0.6875 | 173.709 |
| 0.6881944444444444 | 173.709 |
| 0.688888888888889 | 146.423 |
| 0.6895833333333333 | 169.156 |
| 0.6902777777777778 | 132.814 |
| 0.6909722222222222 | 132.814 |
| 0.6916666666666668 | 141.884 |
| 0.6923611111111111 | 182.82 |
| 0.6930555555555555 | 182.82 |
| 0.69375 | 178.264 |
| 0.6944444444444445 | 146.423 |
| 0.6951388888888889 | 155.509 |
| 0.6958333333333333 | 164.605 |
| 0.6965277777777777 | 169.156 |
| 0.6972222222222223 | 164.605 |
| 0.6979166666666666 | 164.605 |
| 0.6986111111111111 | 164.605 |
| 0.6993055555555556 | 160.056 |
| 0.7000000000000001 | 155.509 |
| 0.7006944444444444 | 155.509 |
| 0.7013888888888888 | 150.964 |
| 0.7020833333333334 | 150.964 |
| 0.7027777777777778 | 150.964 |
| 0.7034722222222222 | 155.509 |
| 0.7041666666666666 | 160.056 |
| 0.7048611111111112 | 155.509 |
| 0.7055555555555556 | 150.964 |
| 0.7062499999999999 | 146.423 |
| 0.7069444444444444 | 141.884 |
| 0.7076388888888889 | 137.347 |
| 0.7083333333333334 | 141.884 |
| 0.7090277777777777 | 146.423 |
| 0.7097222222222223 | 150.964 |
| 0.7104166666666667 | 150.964 |
| 0.7111111111111111 | 146.423 |
| 0.7118055555555555 | 146.423 |
| 0.7125 | 137.347 |
| 0.7131944444444445 | 132.814 |
| 0.7138888888888889 | 128.284 |
| 0.7145833333333332 | 123.758 |
| 0.7152777777777778 | 119.235 |
| 0.7159722222222222 | 155.509 |
| 0.7166666666666667 | 146.423 |
| 0.717361111111111 | 141.884 |
| 0.7180555555555556 | 137.347 |
| 0.71875 | 137.347 |
| 0.7194444444444444 | 137.347 |
| 0.720138888888889 | 137.347 |
| 0.7208333333333333 | 114.716 |
| 0.7215277777777778 | 132.814 |
| 0.7222222222222222 | 137.347 |
| 0.7229166666666668 | 137.347 |
| 0.7236111111111111 | 105.69 |
| 0.7243055555555555 | 114.716 |
| 0.725 | 137.347 |
| 0.7256944444444445 | 164.605 |
| 0.7263888888888889 | 169.156 |
| 0.7270833333333333 | 173.709 |
| 0.7277777777777777 | 178.264 |
| 0.7284722222222223 | 187.378 |
| 0.7291666666666666 | 191.937 |
| 0.7298611111111111 | 191.937 |
| 0.7305555555555556 | 196.497 |
| 0.7312500000000001 | 201.058 |
| 0.7319444444444444 | 201.058 |
| 0.7326388888888888 | 196.497 |
| 0.7333333333333334 | 187.378 |
| 0.7340277777777778 | 169.156 |
| 0.7347222222222222 | 160.056 |
| 0.7354166666666666 | 150.964 |
| 0.7361111111111112 | 146.423 |
| 0.7368055555555556 | 137.347 |
| 0.7374999999999999 | 132.814 |
| 0.7381944444444444 | 132.814 |
| 0.7388888888888889 | 132.814 |
| 0.7395833333333334 | 137.347 |
| 0.7402777777777777 | 137.347 |
| 0.7409722222222223 | 137.347 |
| 0.7416666666666667 | 132.814 |
| 0.7423611111111111 | 132.814 |
| 0.7430555555555555 | 128.284 |
| 0.74375 | 128.284 |
| 0.7444444444444445 | 119.235 |
| 0.7451388888888889 | 92.184 |
| 0.7458333333333332 | 101.184 |
| 0.7465277777777778 | 83.205 |
| 0.7472222222222222 | 83.205 |
| 0.7479166666666667 | 83.205 |
| 0.748611111111111 | 110.201 |
| 0.7493055555555556 | 128.284 |
| 0.75 | 132.814 |
| 0.7506944444444444 | 132.814 |
| 0.751388888888889 | 119.235 |
| 0.7520833333333333 | 132.814 |
| 0.7527777777777778 | 132.814 |
| 0.7534722222222222 | 119.235 |
| 0.7541666666666668 | 101.184 |
| 0.7548611111111111 | 96.682 |
| 0.7555555555555555 | 92.184 |
| 0.75625 | 87.692 |
| 0.7569444444444445 | 83.205 |
| 0.7576388888888889 | 78.722 |
| 0.7583333333333333 | 83.205 |
| 0.7590277777777777 | 78.722 |
| 0.7597222222222223 | 78.722 |
| 0.7604166666666666 | 78.722 |
| 0.7611111111111111 | 74.246 |
| 0.7618055555555556 | 74.246 |
| 0.7625000000000001 | 69.775 |
| 0.7631944444444444 | 69.775 |
| 0.7638888888888888 | 69.775 |
| 0.7645833333333334 | 69.775 |
| 0.7652777777777778 | 69.775 |
| 0.7659722222222222 | 69.775 |
| 0.7666666666666666 | 65.31 |
| 0.7673611111111112 | 60.85 |
| 0.7680555555555556 | 56.398 |
| 0.7687499999999999 | 51.951 |
| 0.7694444444444444 | 51.951 |
| 0.7701388888888889 | 51.951 |
| 0.7708333333333334 | 51.951 |
| 0.7715277777777777 | 51.951 |
| 0.7722222222222223 | 56.398 |
| 0.7729166666666667 | 51.951 |
| 0.7736111111111111 | 51.951 |
| 0.7743055555555555 | 51.951 |
| 0.775 | 47.511 |
| 0.7756944444444445 | 47.511 |
| 0.7763888888888889 | 47.511 |
| 0.7770833333333332 | 43.079 |
| 0.7777777777777778 | 43.079 |
| 0.7784722222222222 | 43.079 |
| 0.7791666666666667 | 43.079 |
| 0.779861111111111 | 43.079 |
| 0.7805555555555556 | 43.079 |
| 0.78125 | 43.079 |
| 0.7819444444444444 | 47.511 |
| 0.782638888888889 | 47.511 |
| 0.7833333333333333 | 51.951 |
| 0.7840277777777778 | 51.951 |
| 0.7847222222222222 | 51.951 |
| 0.7854166666666668 | 51.951 |
| 0.7861111111111111 | 51.951 |
| 0.7868055555555555 | 47.511 |
| 0.7875 | 47.511 |
| 0.7881944444444445 | 43.079 |
| 0.7888888888888889 | 43.079 |
| 0.7895833333333333 | 38.653 |
| 0.7902777777777777 | 38.653 |
| 0.7909722222222223 | 34.234 |
| 0.7916666666666666 | 34.234 |
| 0.7923611111111111 | 34.234 |
| 0.7930555555555556 | 34.234 |
| 0.7937500000000001 | 34.234 |
| 0.7944444444444444 | 34.234 |
| 0.7951388888888888 | 38.653 |
| 0.7958333333333334 | 38.653 |
| 0.7965277777777778 | 38.653 |
| 0.7972222222222222 | 38.653 |
| 0.7979166666666666 | 38.653 |
| 0.7986111111111112 | 38.653 |
| 0.7993055555555556 | 43.079 |
| 0.7999999999999999 | 43.079 |
| 0.8006944444444444 | 43.079 |
| 0.8013888888888889 | 47.511 |
| 0.8020833333333334 | 47.511 |
| 0.8027777777777777 | 47.511 |
| 0.8034722222222223 | 43.079 |
| 0.8041666666666667 | 43.079 |
| 0.8048611111111111 | 38.653 |
| 0.8055555555555555 | 38.653 |
| 0.80625 | 34.234 |
| 0.8069444444444445 | 29.823 |
| 0.8076388888888889 | 29.823 |
| 0.8083333333333332 | 25.419 |
| 0.8090277777777778 | 21.024 |
| 0.8097222222222222 | 21.024 |
| 0.8104166666666667 | 21.024 |
| 0.811111111111111 | 21.024 |
| 0.8118055555555556 | 16.636 |
| 0.8125 | 16.636 |
| 0.8131944444444444 | 16.636 |
| 0.813888888888889 | 16.636 |
| 0.8145833333333333 | 16.636 |
| 0.8152777777777778 | 12.257 |
| 0.8159722222222222 | 12.257 |
| 0.8166666666666668 | 12.257 |
| 0.8173611111111111 | 12.257 |
| 0.8180555555555555 | 12.257 |
| 0.81875 | 12.257 |
| 0.8194444444444445 | 12.257 |
| 0.8201388888888889 | 12.257 |
| 0.8208333333333333 | 12.257 |
| 0.8215277777777777 | 12.257 |
| 0.8222222222222223 | 12.257 |
| 0.8229166666666666 | 12.257 |
| 0.8236111111111111 | 12.257 |
| 0.8243055555555556 | 12.257 |
| 0.8250000000000001 | 12.257 |
| 0.8256944444444444 | 12.257 |
| 0.8263888888888888 | 7.887 |
| 0.8270833333333334 | 7.887 |
| 0.8277777777777778 | 7.887 |
| 0.8284722222222222 | 7.887 |
| 0.8291666666666666 | 7.887 |
| 0.8298611111111112 | 7.887 |
| 0.8305555555555556 | 7.887 |
| 0.8312499999999999 | 3.525 |
| 0.8319444444444444 | 3.525 |
| 0.8326388888888889 | 7.887 |
| 0.8333333333333334 | 3.525 |
| 0.8340277777777777 | 3.525 |
| 0.8347222222222223 | 3.525 |
| 0.8354166666666667 | 3.525 |
| 0.8361111111111111 | 3.525 |
| 0.8368055555555555 | 3.525 |
| 0.8375 | 3.525 |
| 0.8381944444444445 | 3.525 |
| 0.8388888888888889 | 3.525 |
| 0.8395833333333332 | 3.525 |
| 0.8402777777777778 | 3.525 |
| 0.8409722222222222 | 3.525 |
| 0.8416666666666667 | 3.525 |
| 0.842361111111111 | 3.525 |
| 0.8430555555555556 | 3.525 |
| 0.84375 | 3.525 |
| 0.8444444444444444 | 0 |
| 0.845138888888889 | 0 |
| 0.8458333333333333 | 0 |
| 0.8465277777777778 | 0 |
| 0.8472222222222222 | 0 |
| 0.8479166666666668 | 0 |
| 0.8486111111111111 | 0 |
| 0.8493055555555555 | 0 |
| 0.85 | 0 |
| 0.8506944444444445 | 0 |
| 0.8513888888888889 | 0 |
| 0.8520833333333333 | 0 |
| 0.8527777777777777 | 0 |
| 0.8534722222222223 | 0 |
| 0.8541666666666666 | 0 |
| 0.8548611111111111 | 0 |
| 0.8555555555555556 | 0 |
| 0.8562500000000001 | 0 |
| 0.8569444444444444 | 0 |
| 0.8576388888888888 | 0 |
| 0.8583333333333334 | 0 |
| 0.8590277777777778 | 0 |
| 0.8597222222222222 | 0 |
| 0.8604166666666666 | 0 |
| 0.8611111111111112 | 0 |
| 0.8618055555555556 | 0 |
| 0.8624999999999999 | 0 |
| 0.8631944444444444 | 0 |
| 0.8638888888888889 | 0 |
| 0.8645833333333334 | 0 |
| 0.8652777777777777 | 0 |
| 0.8659722222222223 | 0 |
| 0.8666666666666667 | 0 |
| 0.8673611111111111 | 0 |
| 0.8680555555555555 | 0 |
| 0.86875 | 0 |
| 0.8694444444444445 | 0 |
| 0.8701388888888889 | 0 |
| 0.8708333333333332 | 0 |
| 0.8715277777777778 | 0 |
| 0.8722222222222222 | 0 |
| 0.8729166666666667 | 0 |
| 0.873611111111111 | 0 |
| 0.8743055555555556 | 0 |
| 0.875 | 0 |
| 0.8756944444444444 | 0 |
| 0.876388888888889 | 0 |
| 0.8770833333333333 | 0 |
| 0.8777777777777778 | 0 |
| 0.8784722222222222 | 0 |
| 0.8791666666666668 | 0 |
| 0.8798611111111111 | 0 |
| 0.8805555555555555 | 0 |
| 0.88125 | 0 |
| 0.8819444444444445 | 0 |
| 0.8826388888888889 | 0 |
| 0.8833333333333333 | 0 |
| 0.8840277777777777 | 0 |
| 0.8847222222222223 | 0 |
| 0.8854166666666666 | 0 |
| 0.8861111111111111 | 0 |
| 0.8868055555555556 | 0 |
| 0.8875000000000001 | 0 |
| 0.8881944444444444 | 0 |
| 0.8888888888888888 | 0 |
| 0.8895833333333334 | 0 |
| 0.8902777777777778 | 0 |
| 0.8909722222222222 | 0 |
| 0.8916666666666666 | 0 |
| 0.8923611111111112 | 0 |
| 0.8930555555555556 | 0 |
| 0.8937499999999999 | 0 |
| 0.8944444444444444 | 0 |
| 0.8951388888888889 | 0 |
| 0.8958333333333334 | 0 |
| 0.8965277777777777 | 0 |
| 0.8972222222222223 | 0 |
| 0.8979166666666667 | 0 |
| 0.8986111111111111 | 0 |
| 0.8993055555555555 | 0 |
| 0.9 | 0 |
| 0.9006944444444445 | 0 |
| 0.9013888888888889 | 0 |
| 0.9020833333333332 | 0 |
| 0.9027777777777778 | 0 |
| 0.9034722222222222 | 0 |
| 0.9041666666666667 | 0 |
| 0.904861111111111 | 0 |
| 0.9055555555555556 | 0 |
| 0.90625 | 0 |
| 0.9069444444444444 | 0 |
| 0.907638888888889 | 0 |
| 0.9083333333333333 | 0 |
| 0.9090277777777778 | 0 |
| 0.9097222222222222 | 0 |
| 0.9104166666666668 | 0 |
| 0.9111111111111111 | 0 |
| 0.9118055555555555 | 0 |
| 0.9125 | 0 |
| 0.9131944444444445 | 0 |
| 0.9138888888888889 | 0 |
| 0.9145833333333333 | 0 |
| 0.9152777777777777 | 0 |
| 0.9159722222222223 | 0 |
| 0.9166666666666666 | 0 |
| 0.9173611111111111 | 0 |
| 0.9180555555555556 | 0 |
| 0.9187500000000001 | 0 |
| 0.9194444444444444 | 0 |
| 0.9201388888888888 | 0 |
| 0.9208333333333334 | 0 |
| 0.9215277777777778 | 0 |
| 0.9222222222222222 | 0 |
| 0.9229166666666666 | 0 |
| 0.9236111111111112 | 0 |
| 0.9243055555555556 | 0 |
| 0.9249999999999999 | 0 |
| 0.9256944444444444 | 0 |
| 0.9263888888888889 | 0 |
| 0.9270833333333334 | 0 |
| 0.9277777777777777 | 0 |
| 0.9284722222222223 | 0 |
| 0.9291666666666667 | 0 |
| 0.9298611111111111 | 0 |
| 0.9305555555555555 | 0 |
| 0.93125 | 0 |
| 0.9319444444444445 | 0 |
| 0.9326388888888889 | 0 |
| 0.9333333333333332 | 0 |
| 0.9340277777777778 | 0 |
| 0.9347222222222222 | 0 |
| 0.9354166666666667 | 0 |
| 0.936111111111111 | 0 |
| 0.9368055555555556 | 0 |
| 0.9375 | 0 |
| 0.9381944444444444 | 0 |
| 0.938888888888889 | 0 |
| 0.9395833333333333 | 0 |
| 0.9402777777777778 | 0 |
| 0.9409722222222222 | 0 |
| 0.9416666666666668 | 0 |
| 0.9423611111111111 | 0 |
| 0.9430555555555555 | 0 |
| 0.94375 | 0 |
| 0.9444444444444445 | 0 |
| 0.9451388888888889 | 0 |
| 0.9458333333333333 | 0 |
| 0.9465277777777777 | 0 |
| 0.9472222222222223 | 0 |
| 0.9479166666666666 | 0 |
| 0.9486111111111111 | 0 |
| 0.9493055555555556 | 0 |
| 0.9500000000000001 | 0 |
| 0.9506944444444444 | 0 |
| 0.9513888888888888 | 0 |
| 0.9520833333333334 | 0 |
| 0.9527777777777778 | 0 |
| 0.9534722222222222 | 0 |
| 0.9541666666666666 | 0 |
| 0.9548611111111112 | 0 |
| 0.9555555555555556 | 0 |
| 0.9562499999999999 | 0 |
| 0.9569444444444444 | 0 |
| 0.9576388888888889 | 0 |
| 0.9583333333333334 | 0 |
| 0.9590277777777777 | 0 |
| 0.9597222222222223 | 0 |
| 0.9604166666666667 | 0 |
| 0.9611111111111111 | 0 |
| 0.9618055555555555 | 0 |
| 0.9625 | 0 |
| 0.9631944444444445 | 0 |
| 0.9638888888888889 | 0 |
| 0.9645833333333332 | 0 |
| 0.9652777777777778 | 0 |
| 0.9659722222222222 | 0 |
| 0.9666666666666667 | 0 |
| 0.967361111111111 | 0 |
| 0.9680555555555556 | 0 |
| 0.96875 | 0 |
| 0.9694444444444444 | 0 |
| 0.970138888888889 | 0 |
| 0.9708333333333333 | 0 |
| 0.9715277777777778 | 0 |
| 0.9722222222222222 | 0 |
| 0.9729166666666668 | 0 |
| 0.9736111111111111 | 0 |
| 0.9743055555555555 | 0 |
| 0.975 | 0 |
| 0.9756944444444445 | 0 |
| 0.9763888888888889 | 0 |
| 0.9770833333333333 | 0 |
| 0.9777777777777777 | 0 |
| 0.9784722222222223 | 0 |
| 0.9791666666666666 | 0 |
| 0.9798611111111111 | 0 |
| 0.9805555555555556 | 0 |
| 0.9812500000000001 | 0 |
| 0.9819444444444444 | 0 |
| 0.9826388888888888 | 0 |
| 0.9833333333333334 | 0 |
| 0.9840277777777778 | 0 |
| 0.9847222222222222 | 0 |
| 0.9854166666666666 | 0 |
| 0.9861111111111112 | 0 |
| 0.9868055555555556 | 0 |
| 0.9874999999999999 | 0 |
| 0.9881944444444444 | 0 |
| 0.9888888888888889 | 0 |
| 0.9895833333333334 | 0 |
| 0.9902777777777777 | 0 |
| 0.9909722222222223 | 0 |
| 0.9916666666666667 | 0 |
| 0.9923611111111111 | 0 |
| 0.9930555555555555 | 0 |
| 0.99375 | 0 |
| 0.9944444444444445 | 0 |
| 0.9951388888888889 | 0 |
| 0.9958333333333332 | 0 |
| 0.9965277777777778 | 0 |
| 0.9972222222222222 | 0 |
| 0.9979166666666667 | 0 |
| 0.998611111111111 | 0 |
| 0.9993055555555556 | 0 |